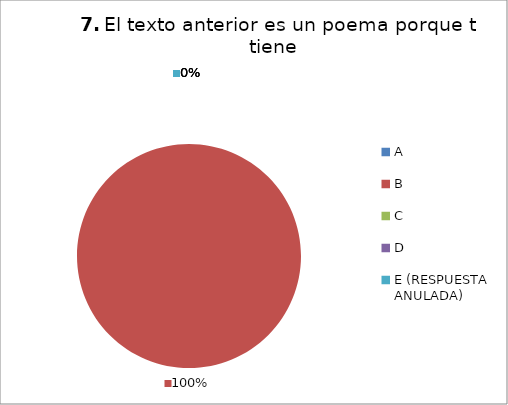
| Category | CANTIDAD DE RESPUESTAS PREGUNTA (7) | PORCENTAJE |
|---|---|---|
| A | 0 | 0 |
| B | 36 | 1 |
| C | 0 | 0 |
| D | 0 | 0 |
| E (RESPUESTA ANULADA) | 0 | 0 |